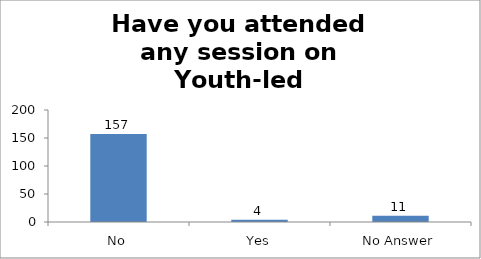
| Category | Have you attended any session on Youth-led Changemaking before? |
|---|---|
| No | 157 |
| Yes | 4 |
| No Answer | 11 |